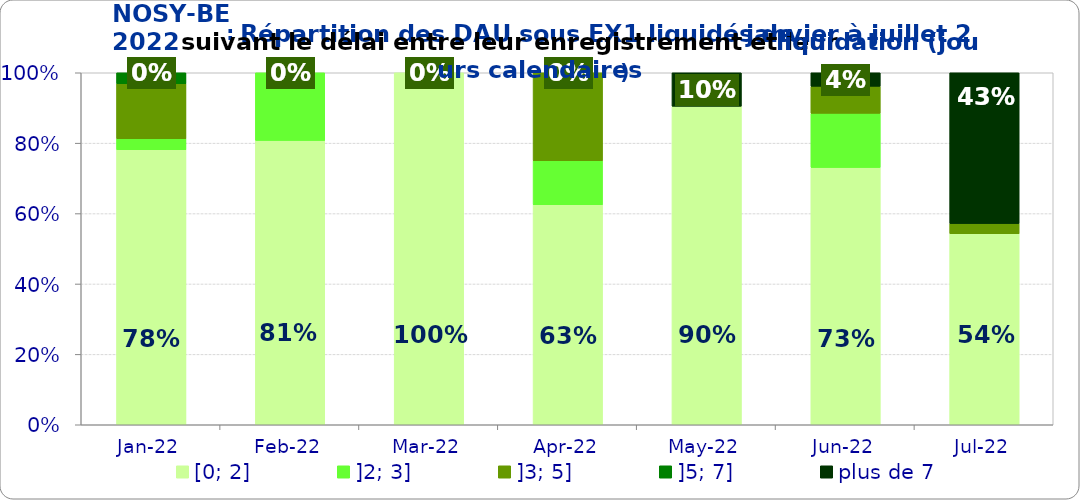
| Category | [0; 2] | ]2; 3] | ]3; 5] | ]5; 7] | plus de 7 |
|---|---|---|---|---|---|
| 2022-01-01 | 0.781 | 0.031 | 0.156 | 0.031 | 0 |
| 2022-02-01 | 0.808 | 0.192 | 0 | 0 | 0 |
| 2022-03-01 | 1 | 0 | 0 | 0 | 0 |
| 2022-04-01 | 0.625 | 0.125 | 0.25 | 0 | 0 |
| 2022-05-01 | 0.905 | 0 | 0 | 0 | 0.095 |
| 2022-06-01 | 0.731 | 0.154 | 0.077 | 0 | 0.038 |
| 2022-07-01 | 0.543 | 0 | 0.029 | 0 | 0.429 |